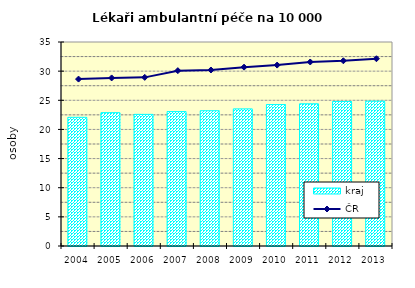
| Category | kraj |
|---|---|
| 2004.0 | 22.078 |
| 2005.0 | 22.878 |
| 2006.0 | 22.584 |
| 2007.0 | 23.061 |
| 2008.0 | 23.205 |
| 2009.0 | 23.524 |
| 2010.0 | 24.266 |
| 2011.0 | 24.398 |
| 2012.0 | 24.798 |
| 2013.0 | 24.853 |